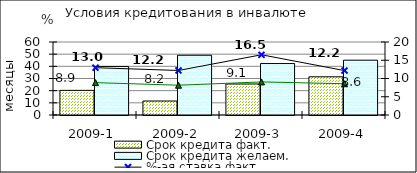
| Category | Срок кредита факт.  | Срок кредита желаем. |
|---|---|---|
| 2009-1 | 20.25 | 39.89 |
| 2009-2 | 11.5 | 49.1 |
| 2009-3 | 25.5 | 42.28 |
| 2009-4 | 31.4 | 45.06 |